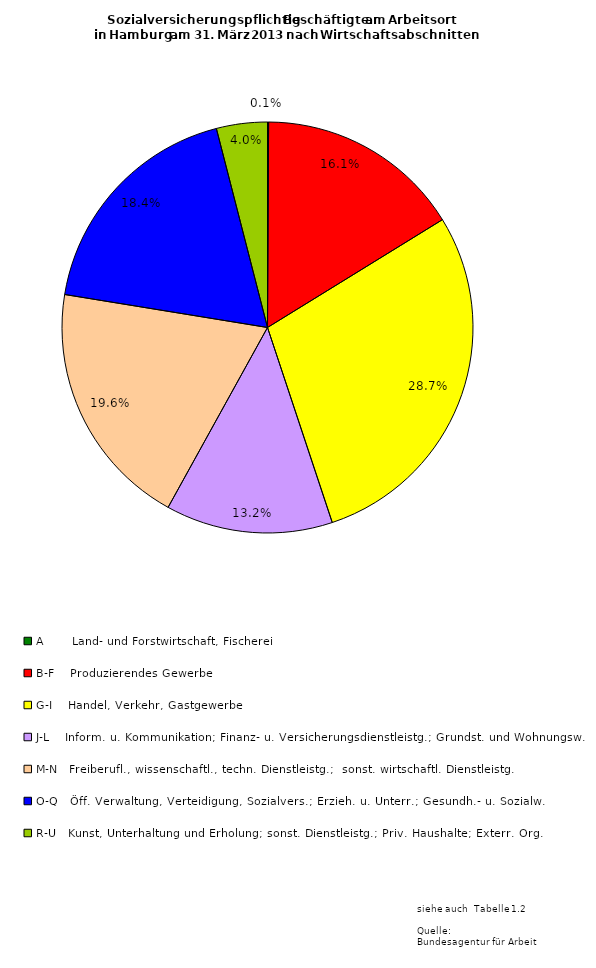
| Category | Series 0 | Series 1 | Series 2 |
|---|---|---|---|
| A       Land- und Forstwirtschaft, Fischerei | 749 | 239 | 510 |
| B-F    Produzierendes Gewerbe | 139974 | 30201 | 109773 |
| G-I    Handel, Verkehr, Gastgewerbe | 249041 | 105273 | 143768 |
| J-L    Inform. u. Kommunikation; Finanz- u. Versicherungsdienstleistg.; Grundst. und Wohnungsw. | 114062 | 51398 | 62664 |
| M-N   Freiberufl., wissenschaftl., techn. Dienstleistg.;  sonst. wirtschaftl. Dienstleistg.  | 169567 | 83004 | 86563 |
| O-Q   Öff. Verwaltung, Verteidigung, Sozialvers.; Erzieh. u. Unterr.; Gesundh.- u. Sozialw. | 159980 | 114427 | 45553 |
| R-U   Kunst, Unterhaltung und Erholung; sonst. Dienstleistg.; Priv. Haushalte; Exterr. Org. | 34759 | 20912 | 13847 |